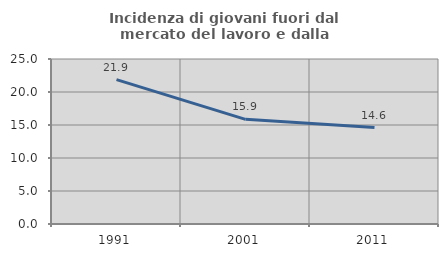
| Category | Incidenza di giovani fuori dal mercato del lavoro e dalla formazione  |
|---|---|
| 1991.0 | 21.867 |
| 2001.0 | 15.858 |
| 2011.0 | 14.618 |